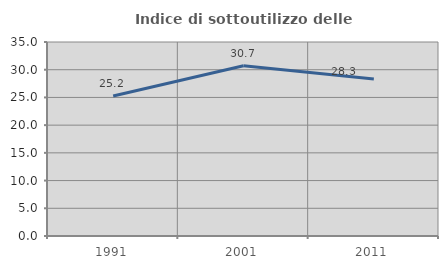
| Category | Indice di sottoutilizzo delle abitazioni  |
|---|---|
| 1991.0 | 25.248 |
| 2001.0 | 30.724 |
| 2011.0 | 28.339 |